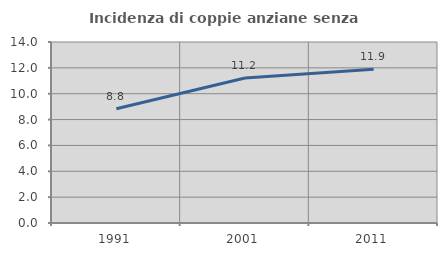
| Category | Incidenza di coppie anziane senza figli  |
|---|---|
| 1991.0 | 8.836 |
| 2001.0 | 11.221 |
| 2011.0 | 11.897 |